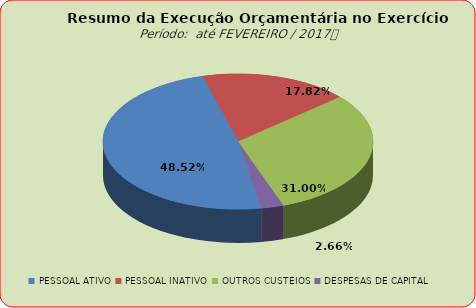
| Category | Series 0 |
|---|---|
| PESSOAL ATIVO | 26760048.26 |
| PESSOAL INATIVO | 9829155.1 |
| OUTROS CUSTEIOS | 17093602.49 |
| DESPESAS DE CAPITAL | 1464212.86 |